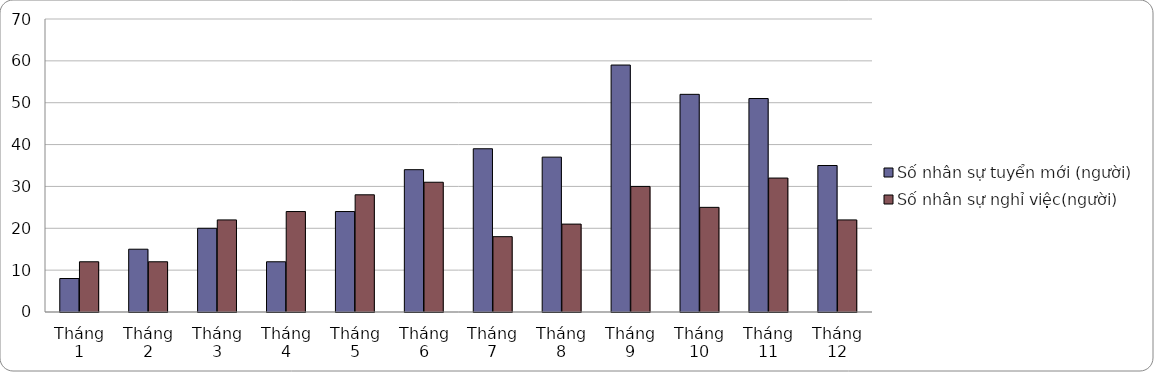
| Category | Số nhân sự tuyển mới (người) | Số nhân sự nghỉ việc(người) |
|---|---|---|
| Tháng 1 | 8 | 12 |
| Tháng 2 | 15 | 12 |
| Tháng 3 | 20 | 22 |
| Tháng 4 | 12 | 24 |
| Tháng 5 | 24 | 28 |
| Tháng 6 | 34 | 31 |
| Tháng 7 | 39 | 18 |
| Tháng 8 | 37 | 21 |
| Tháng 9 | 59 | 30 |
| Tháng 10 | 52 | 25 |
| Tháng 11 | 51 | 32 |
| Tháng 12 | 35 | 22 |